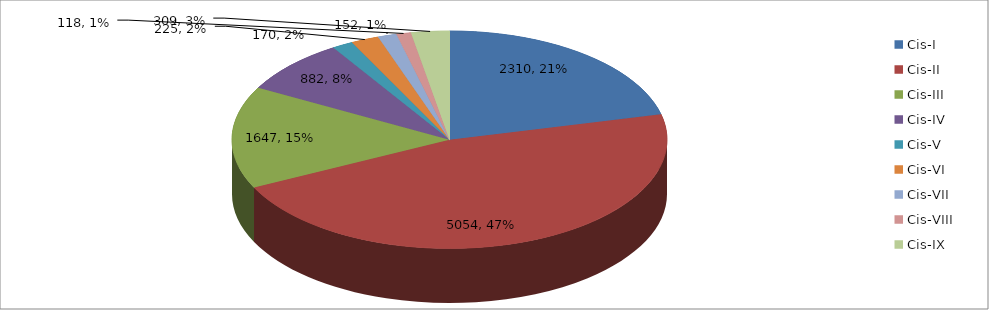
| Category | Series 0 |
|---|---|
| Cis-I | 2310 |
| Cis-II | 5054 |
| Cis-III | 1647 |
| Cis-IV | 882 |
| Cis-V | 170 |
| Cis-VI | 225 |
| Cis-VII | 152 |
| Cis-VIII | 118 |
| Cis-IX | 309 |